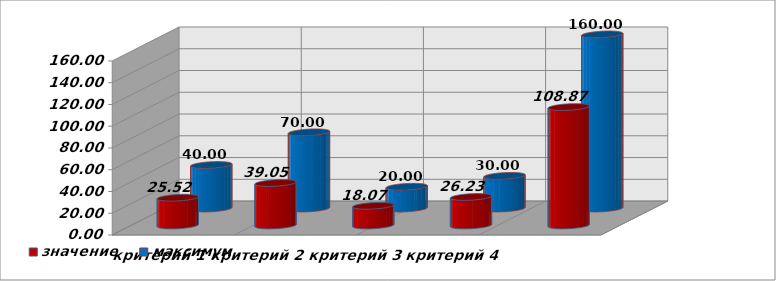
| Category | значение | максимум |
|---|---|---|
| критерий 1 | 25.518 | 40 |
| критерий 2 | 39.053 | 70 |
| критерий 3 | 18.07 | 20 |
| критерий 4 | 26.227 | 30 |